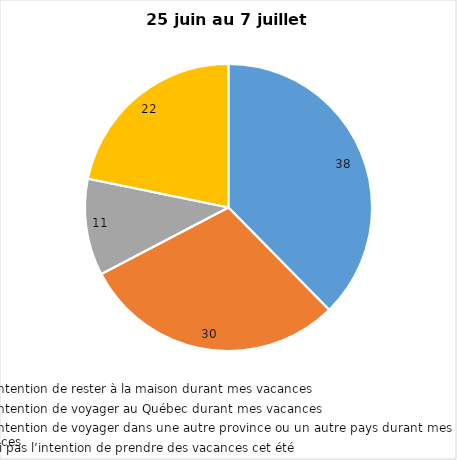
| Category | Series 0 |
|---|---|
| J’ai l’intention de rester à la maison durant mes vacances | 38 |
| J’ai l’intention de voyager au Québec durant mes vacances | 30 |
| J’ai l’intention de voyager dans une autre province ou un autre pays durant mes vacances | 11 |
| Je n’ai pas l’intention de prendre des vacances cet été | 22 |